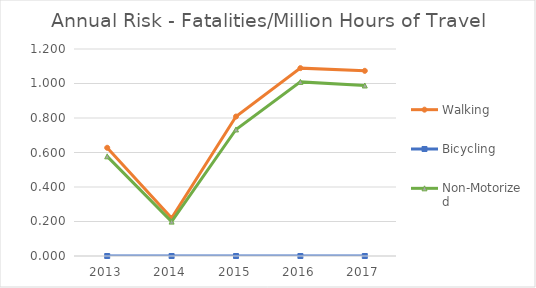
| Category | Walking | Bicycling | Non-Motorized |
|---|---|---|---|
| 2013 | 0.627 | 0 | 0.578 |
| 2014 | 0.22 | 0 | 0.199 |
| 2015 | 0.808 | 0 | 0.734 |
| 2016 | 1.089 | 0 | 1.009 |
| 2017 | 1.073 | 0 | 0.988 |